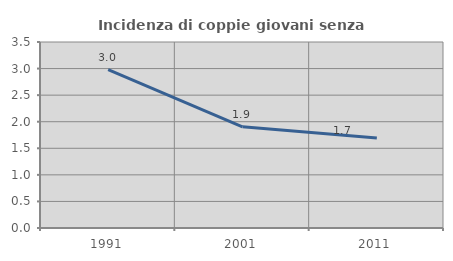
| Category | Incidenza di coppie giovani senza figli |
|---|---|
| 1991.0 | 2.979 |
| 2001.0 | 1.905 |
| 2011.0 | 1.695 |